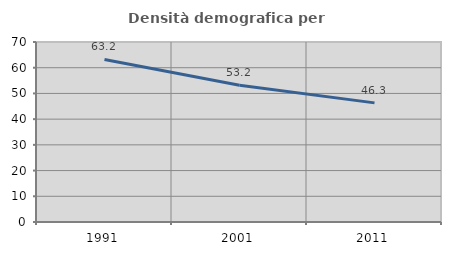
| Category | Densità demografica |
|---|---|
| 1991.0 | 63.231 |
| 2001.0 | 53.177 |
| 2011.0 | 46.326 |